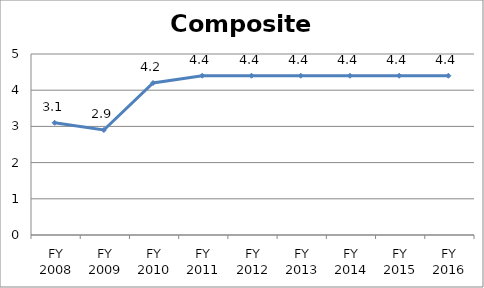
| Category | Composite score |
|---|---|
| FY 2016 | 4.4 |
| FY 2015 | 4.4 |
| FY 2014 | 4.4 |
| FY 2013 | 4.4 |
| FY 2012 | 4.4 |
| FY 2011 | 4.4 |
| FY 2010 | 4.2 |
| FY 2009 | 2.9 |
| FY 2008 | 3.1 |